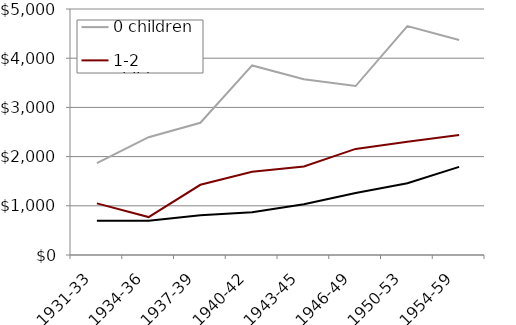
| Category | 0 children | 1-2 children | 3+ children |
|---|---|---|---|
| 1931-33 | 1869.348 | 1048.663 | 694.455 |
| 1934-36 | 2393.863 | 771.095 | 695.724 |
| 1937-39 | 2687.821 | 1426.763 | 807.35 |
| 1940-42 | 3852.894 | 1692.832 | 868.588 |
| 1943-45 | 3573.124 | 1799.48 | 1032.666 |
| 1946-49 | 3434.355 | 2156.469 | 1260.923 |
| 1950-53 | 4652.707 | 2302.226 | 1457.647 |
| 1954-59 | 4369.333 | 2439.346 | 1791.833 |